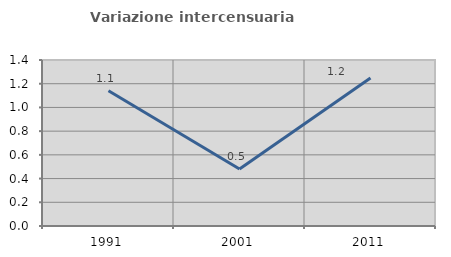
| Category | Variazione intercensuaria annua |
|---|---|
| 1991.0 | 1.141 |
| 2001.0 | 0.48 |
| 2011.0 | 1.248 |